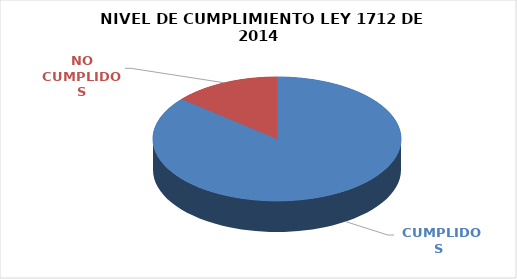
| Category | Series 0 |
|---|---|
|  CUMPLIDOS | 99 |
| NO CUMPLIDOS | 16 |